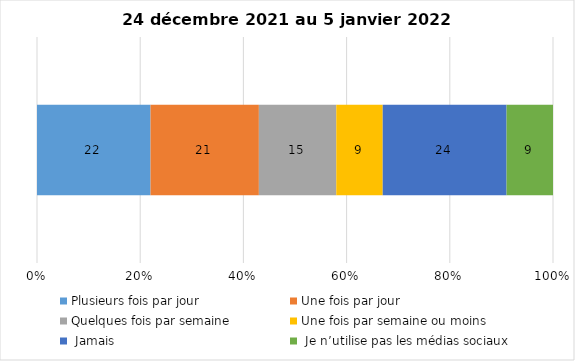
| Category | Plusieurs fois par jour | Une fois par jour | Quelques fois par semaine   | Une fois par semaine ou moins   |  Jamais   |  Je n’utilise pas les médias sociaux |
|---|---|---|---|---|---|---|
| 0 | 22 | 21 | 15 | 9 | 24 | 9 |